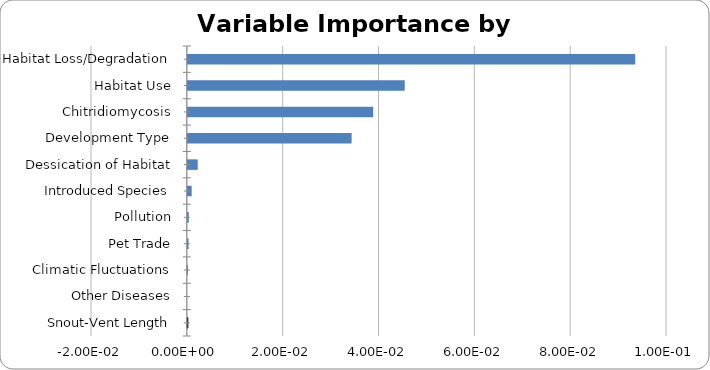
| Category | Series 0 |
|---|---|
| Habitat Loss/Degradation | 0.093 |
| Habitat Use | 0.045 |
| Chitridiomycosis | 0.039 |
| Development Type | 0.034 |
| Dessication of Habitat | 0.002 |
| Introduced Species | 0.001 |
| Pollution | 0 |
| Pet Trade | 0 |
| Climatic Fluctuations | 0 |
| Other Diseases | 0 |
| Snout-Vent Length | 0 |